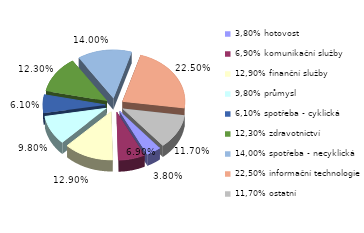
| Category | Series 0 |
|---|---|
| 3,80% hotovost | 0.038 |
| 6,90% komunikační služby | 0.069 |
| 12,90% finanční služby | 0.129 |
| 9,80% průmysl | 0.098 |
| 6,10% spotřeba - cyklická | 0.061 |
| 12,30% zdravotnictví | 0.123 |
| 14,00% spotřeba - necyklická | 0.14 |
| 22,50% informační technologie | 0.225 |
| 11,70% ostatní | 0.117 |